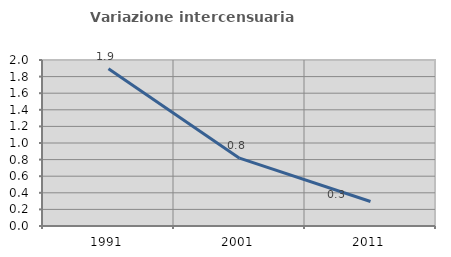
| Category | Variazione intercensuaria annua |
|---|---|
| 1991.0 | 1.896 |
| 2001.0 | 0.817 |
| 2011.0 | 0.295 |